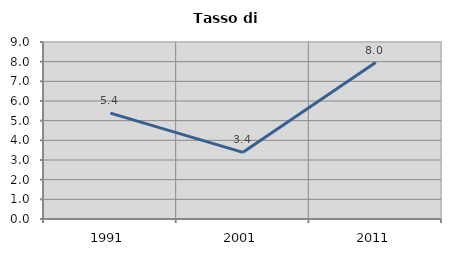
| Category | Tasso di disoccupazione   |
|---|---|
| 1991.0 | 5.386 |
| 2001.0 | 3.391 |
| 2011.0 | 7.954 |